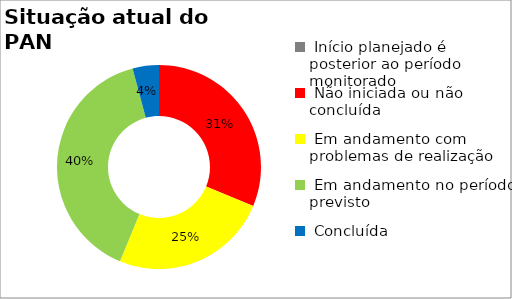
| Category | Series 0 |
|---|---|
|  Início planejado é posterior ao período monitorado | 0 |
|  Não iniciada ou não concluída | 0.312 |
|  Em andamento com problemas de realização | 0.25 |
|  Em andamento no período previsto  | 0.396 |
|  Concluída | 0.042 |